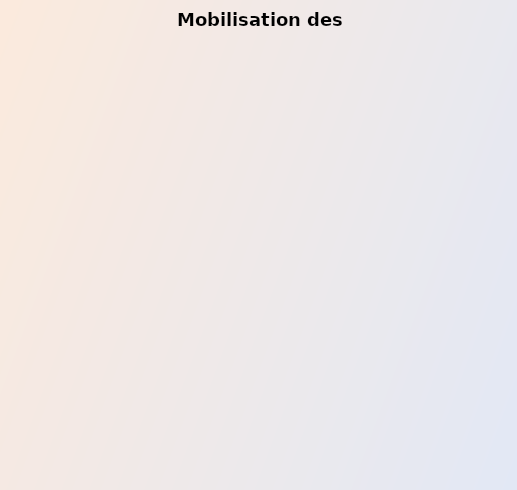
| Category | Series 0 |
|---|---|
| Planification et mise en œuvre de la mobilisation des ressources | 2.5 |
| Diversification des ressources | 2 |
| Suivi des ressources | 3 |